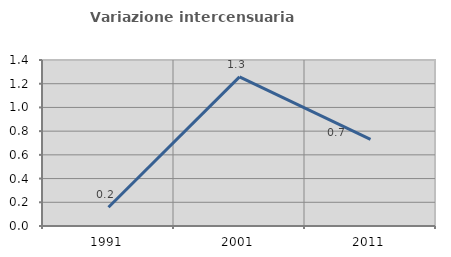
| Category | Variazione intercensuaria annua |
|---|---|
| 1991.0 | 0.158 |
| 2001.0 | 1.257 |
| 2011.0 | 0.73 |